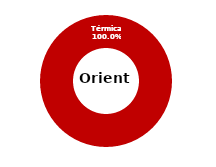
| Category | Oriente |
|---|---|
| Eólica | 0 |
| Hidráulica | 0 |
| Solar | 0 |
| Térmica | 37.447 |